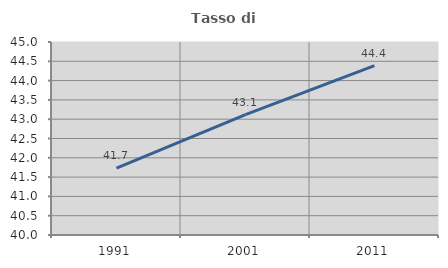
| Category | Tasso di occupazione   |
|---|---|
| 1991.0 | 41.73 |
| 2001.0 | 43.118 |
| 2011.0 | 44.386 |